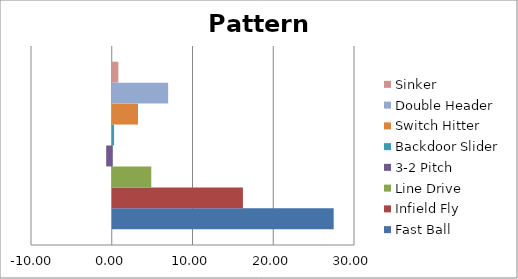
| Category | Fast Ball | Infield Fly | Line Drive | 3-2 Pitch | Backdoor Slider | Switch Hitter | Double Header | Sinker |
|---|---|---|---|---|---|---|---|---|
| 0 | 27.36 | 16.12 | 4.77 | -0.69 | 0.16 | 3.13 | 6.86 | 0.69 |